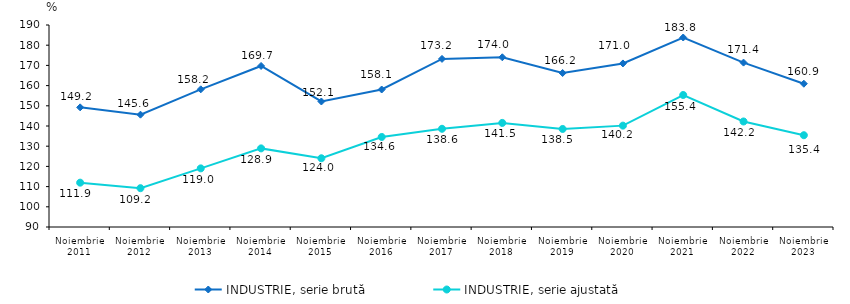
| Category | INDUSTRIE, serie brută | INDUSTRIE, serie ajustată |
|---|---|---|
| Noiembrie
2011 | 149.228 | 111.946 |
| Noiembrie
2012 | 145.606 | 109.226 |
| Noiembrie
2013 | 158.155 | 119.026 |
| Noiembrie
2014 | 169.724 | 128.916 |
| Noiembrie
2015 | 152.135 | 124.028 |
| Noiembrie
2016 | 158.068 | 134.569 |
| Noiembrie
2017 | 173.216 | 138.628 |
| Noiembrie
2018 | 174.017 | 141.524 |
| Noiembrie
2019 | 166.237 | 138.527 |
| Noiembrie
2020 | 170.965 | 140.185 |
| Noiembrie
2021 | 183.806 | 155.351 |
| Noiembrie
2022 | 171.384 | 142.237 |
| Noiembrie
2023 | 160.926 | 135.435 |